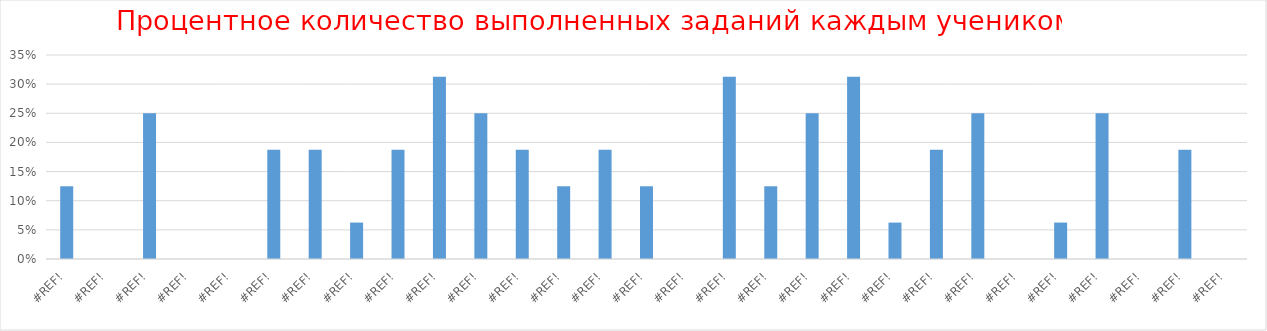
| Category | Series 0 |
|---|---|
| 0.0 | 0.125 |
| 0.0 | 0 |
| 0.0 | 0.25 |
| 0.0 | 0 |
| 0.0 | 0 |
| 0.0 | 0.188 |
| 0.0 | 0.188 |
| 0.0 | 0.062 |
| 0.0 | 0.188 |
| 0.0 | 0.312 |
| 0.0 | 0.25 |
| 0.0 | 0.188 |
| 0.0 | 0.125 |
| 0.0 | 0.188 |
| 0.0 | 0.125 |
| 0.0 | 0 |
| 0.0 | 0.312 |
| 0.0 | 0.125 |
| 0.0 | 0.25 |
| 0.0 | 0.312 |
| 0.0 | 0.062 |
| 0.0 | 0.188 |
| 0.0 | 0.25 |
| 0.0 | 0 |
| 0.0 | 0.062 |
| 0.0 | 0.25 |
| 0.0 | 0 |
| 0.0 | 0.188 |
| 0.0 | 0 |